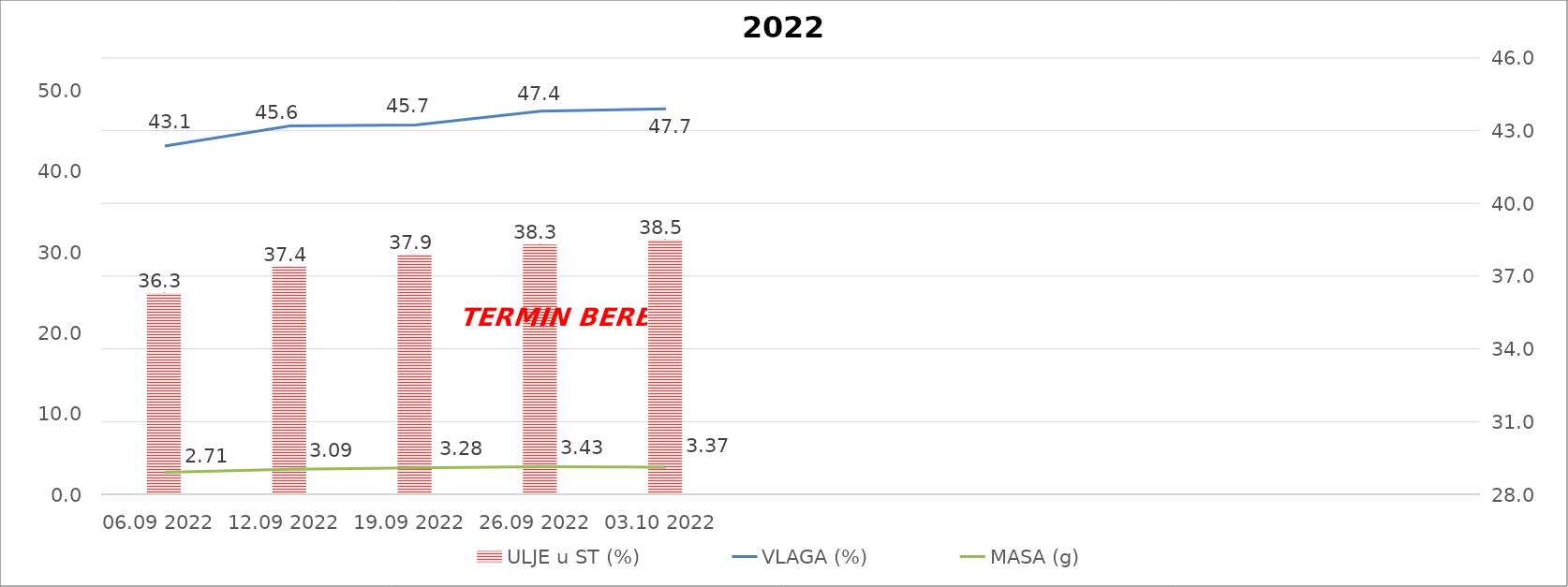
| Category | ULJE u ST (%) |
|---|---|
| 06.09 2022 | 36.3 |
| 12.09 2022 | 37.4 |
| 19.09 2022 | 37.9 |
| 26.09 2022 | 38.3 |
| 03.10 2022 | 38.5 |